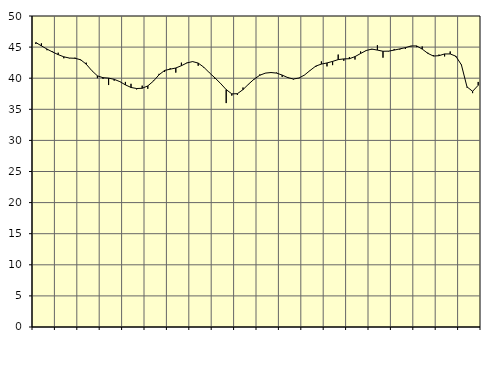
| Category | Piggar | Series 1 |
|---|---|---|
| nan | 45.5 | 45.74 |
| 1.0 | 45.6 | 45.2 |
| 1.0 | 44.5 | 44.68 |
| 1.0 | 44.3 | 44.21 |
| nan | 44.1 | 43.79 |
| 2.0 | 43.2 | 43.44 |
| 2.0 | 43.2 | 43.24 |
| 2.0 | 43.3 | 43.2 |
| nan | 42.9 | 42.97 |
| 3.0 | 42.5 | 42.26 |
| 3.0 | 41.2 | 41.22 |
| 3.0 | 40 | 40.38 |
| nan | 39.9 | 40.08 |
| 4.0 | 38.9 | 40.01 |
| 4.0 | 39.6 | 39.82 |
| 4.0 | 39.5 | 39.45 |
| nan | 39.4 | 38.93 |
| 5.0 | 39.1 | 38.51 |
| 5.0 | 38.2 | 38.34 |
| 5.0 | 38.8 | 38.38 |
| nan | 38.3 | 38.76 |
| 6.0 | 39.6 | 39.53 |
| 6.0 | 40.7 | 40.54 |
| 6.0 | 41 | 41.25 |
| nan | 41.6 | 41.45 |
| 7.0 | 40.9 | 41.64 |
| 7.0 | 42.5 | 42.01 |
| 7.0 | 42.5 | 42.46 |
| nan | 42.7 | 42.67 |
| 8.0 | 42 | 42.43 |
| 8.0 | 41.7 | 41.77 |
| 8.0 | 40.9 | 40.87 |
| nan | 39.9 | 40.04 |
| 9.0 | 39.2 | 39.15 |
| 9.0 | 36 | 38.17 |
| 9.0 | 37.2 | 37.48 |
| nan | 37.3 | 37.51 |
| 10.0 | 38.5 | 38.17 |
| 10.0 | 39 | 39.05 |
| 10.0 | 39.8 | 39.86 |
| nan | 40.6 | 40.47 |
| 11.0 | 40.8 | 40.82 |
| 11.0 | 40.9 | 40.91 |
| 11.0 | 40.9 | 40.82 |
| nan | 40.2 | 40.5 |
| 12.0 | 40.2 | 40.09 |
| 12.0 | 39.8 | 39.87 |
| 12.0 | 40 | 40.03 |
| nan | 40.5 | 40.52 |
| 13.0 | 41.3 | 41.26 |
| 13.0 | 41.8 | 41.95 |
| 13.0 | 42.7 | 42.27 |
| nan | 41.9 | 42.45 |
| 14.0 | 42.1 | 42.7 |
| 14.0 | 43.8 | 42.99 |
| 14.0 | 42.8 | 43.1 |
| nan | 43.4 | 43.13 |
| 15.0 | 43 | 43.47 |
| 15.0 | 44.3 | 43.97 |
| 15.0 | 44.4 | 44.45 |
| nan | 44.6 | 44.68 |
| 16.0 | 45.3 | 44.52 |
| 16.0 | 43.3 | 44.33 |
| 16.0 | 44.3 | 44.35 |
| nan | 44.7 | 44.52 |
| 17.0 | 44.6 | 44.71 |
| 17.0 | 44.7 | 44.91 |
| 17.0 | 45.1 | 45.18 |
| nan | 45 | 45.19 |
| 18.0 | 45.1 | 44.68 |
| 18.0 | 44.1 | 44 |
| 18.0 | 43.7 | 43.56 |
| nan | 43.8 | 43.62 |
| 19.0 | 43.5 | 43.9 |
| 19.0 | 44.3 | 43.9 |
| 19.0 | 43.4 | 43.54 |
| nan | 42.2 | 42.15 |
| 20.0 | 38.5 | 38.61 |
| 20.0 | 37.6 | 37.89 |
| 20.0 | 39.4 | 38.86 |